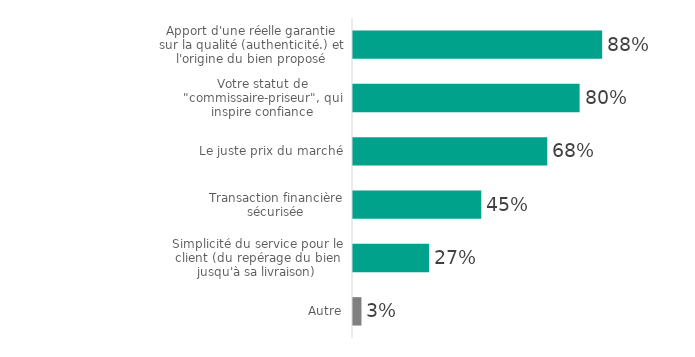
| Category | Series 0 |
|---|---|
| Apport d'une réelle garantie sur la qualité (authenticité.) et l'origine du bien proposé | 87.693 |
| Votre statut de "commissaire-priseur", qui inspire confiance | 79.745 |
| Le juste prix du marché | 68.369 |
| Transaction financière sécurisée | 45.148 |
| Simplicité du service pour le client (du repérage du bien jusqu'à sa livraison) | 26.766 |
| Autre | 2.983 |